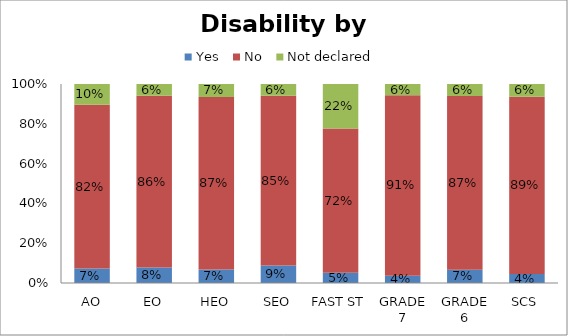
| Category | Yes | No | Not declared |
|---|---|---|---|
| AO | 0.073 | 0.823 | 0.104 |
| EO | 0.077 | 0.864 | 0.059 |
| HEO | 0.068 | 0.867 | 0.065 |
| SEO | 0.088 | 0.854 | 0.058 |
| FAST ST | 0.052 | 0.724 | 0.224 |
| GRADE 7 | 0.037 | 0.907 | 0.056 |
| GRADE 6 | 0.066 | 0.873 | 0.061 |
| SCS | 0.045 | 0.891 | 0.064 |